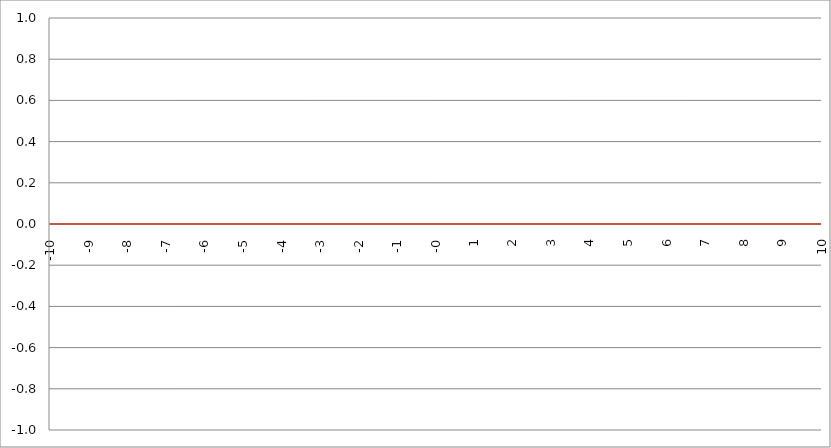
| Category | Series 1 |
|---|---|
| -10.0 | 0 |
| -9.99 | 0 |
| -9.98 | 0 |
| -9.97 | 0 |
| -9.96 | 0 |
| -9.95 | 0 |
| -9.940000000000001 | 0 |
| -9.930000000000001 | 0 |
| -9.920000000000002 | 0 |
| -9.91 | 0 |
| -9.900000000000002 | 0 |
| -9.890000000000002 | 0 |
| -9.880000000000003 | 0 |
| -9.870000000000003 | 0 |
| -9.860000000000001 | 0 |
| -9.850000000000003 | 0 |
| -9.840000000000003 | 0 |
| -9.830000000000004 | 0 |
| -9.820000000000004 | 0 |
| -9.810000000000004 | 0 |
| -9.800000000000004 | 0 |
| -9.790000000000004 | 0 |
| -9.780000000000005 | 0 |
| -9.770000000000005 | 0 |
| -9.760000000000005 | 0 |
| -9.750000000000005 | 0 |
| -9.740000000000006 | 0 |
| -9.730000000000006 | 0 |
| -9.720000000000006 | 0 |
| -9.710000000000006 | 0 |
| -9.700000000000006 | 0 |
| -9.690000000000007 | 0 |
| -9.680000000000007 | 0 |
| -9.670000000000007 | 0 |
| -9.660000000000007 | 0 |
| -9.650000000000007 | 0 |
| -9.640000000000008 | 0 |
| -9.630000000000008 | 0 |
| -9.620000000000008 | 0 |
| -9.610000000000008 | 0 |
| -9.600000000000009 | 0 |
| -9.590000000000009 | 0 |
| -9.580000000000007 | 0 |
| -9.57000000000001 | 0 |
| -9.56000000000001 | 0 |
| -9.55000000000001 | 0 |
| -9.54000000000001 | 0 |
| -9.53000000000001 | 0 |
| -9.52000000000001 | 0 |
| -9.51000000000001 | 0 |
| -9.50000000000001 | 0 |
| -9.49000000000001 | 0 |
| -9.48000000000001 | 0 |
| -9.47000000000001 | 0 |
| -9.46000000000001 | 0 |
| -9.45000000000001 | 0 |
| -9.44000000000001 | 0 |
| -9.430000000000012 | 0 |
| -9.420000000000012 | 0 |
| -9.410000000000013 | 0 |
| -9.400000000000013 | 0 |
| -9.390000000000011 | 0 |
| -9.380000000000013 | 0 |
| -9.370000000000013 | 0 |
| -9.360000000000014 | 0 |
| -9.350000000000014 | 0 |
| -9.340000000000014 | 0 |
| -9.330000000000014 | 0 |
| -9.320000000000014 | 0 |
| -9.310000000000015 | 0 |
| -9.300000000000013 | 0 |
| -9.290000000000015 | 0 |
| -9.280000000000015 | 0 |
| -9.270000000000016 | 0 |
| -9.260000000000016 | 0 |
| -9.250000000000014 | 0 |
| -9.240000000000016 | 0 |
| -9.230000000000016 | 0 |
| -9.220000000000017 | 0 |
| -9.210000000000017 | 0 |
| -9.200000000000017 | 0 |
| -9.190000000000017 | 0 |
| -9.180000000000017 | 0 |
| -9.170000000000018 | 0 |
| -9.160000000000016 | 0 |
| -9.150000000000018 | 0 |
| -9.140000000000018 | 0 |
| -9.130000000000019 | 0 |
| -9.120000000000019 | 0 |
| -9.110000000000017 | 0 |
| -9.10000000000002 | 0 |
| -9.09000000000002 | 0 |
| -9.08000000000002 | 0 |
| -9.07000000000002 | 0 |
| -9.06000000000002 | 0 |
| -9.05000000000002 | 0 |
| -9.04000000000002 | 0 |
| -9.03000000000002 | 0 |
| -9.020000000000021 | 0 |
| -9.010000000000021 | 0 |
| -9.000000000000021 | 0 |
| -8.990000000000022 | 0 |
| -8.980000000000022 | 0 |
| -8.97000000000002 | 0 |
| -8.960000000000022 | 0 |
| -8.950000000000022 | 0 |
| -8.940000000000023 | 0 |
| -8.930000000000023 | 0 |
| -8.920000000000023 | 0 |
| -8.910000000000023 | 0 |
| -8.900000000000023 | 0 |
| -8.890000000000024 | 0 |
| -8.880000000000024 | 0 |
| -8.870000000000024 | 0 |
| -8.860000000000024 | 0 |
| -8.850000000000025 | 0 |
| -8.840000000000025 | 0 |
| -8.830000000000025 | 0 |
| -8.820000000000025 | 0 |
| -8.810000000000025 | 0 |
| -8.800000000000026 | 0 |
| -8.790000000000026 | 0 |
| -8.780000000000026 | 0 |
| -8.770000000000026 | 0 |
| -8.760000000000026 | 0 |
| -8.750000000000027 | 0 |
| -8.740000000000027 | 0 |
| -8.730000000000027 | 0 |
| -8.720000000000027 | 0 |
| -8.710000000000027 | 0 |
| -8.700000000000028 | 0 |
| -8.690000000000028 | 0 |
| -8.680000000000028 | 0 |
| -8.670000000000028 | 0 |
| -8.660000000000029 | 0 |
| -8.650000000000029 | 0 |
| -8.640000000000029 | 0 |
| -8.63000000000003 | 0 |
| -8.62000000000003 | 0 |
| -8.61000000000003 | 0 |
| -8.60000000000003 | 0 |
| -8.59000000000003 | 0 |
| -8.58000000000003 | 0 |
| -8.57000000000003 | 0 |
| -8.56000000000003 | 0 |
| -8.55000000000003 | 0 |
| -8.540000000000031 | 0 |
| -8.530000000000031 | 0 |
| -8.520000000000032 | 0 |
| -8.510000000000032 | 0 |
| -8.50000000000003 | 0 |
| -8.490000000000032 | 0 |
| -8.480000000000032 | 0 |
| -8.470000000000033 | 0 |
| -8.460000000000033 | 0 |
| -8.450000000000033 | 0 |
| -8.440000000000033 | 0 |
| -8.430000000000033 | 0 |
| -8.420000000000034 | 0 |
| -8.410000000000032 | 0 |
| -8.400000000000034 | 0 |
| -8.390000000000034 | 0 |
| -8.380000000000035 | 0 |
| -8.370000000000035 | 0 |
| -8.360000000000033 | 0 |
| -8.350000000000035 | 0 |
| -8.340000000000035 | 0 |
| -8.330000000000036 | 0 |
| -8.320000000000036 | 0 |
| -8.310000000000034 | 0 |
| -8.300000000000036 | 0 |
| -8.290000000000036 | 0 |
| -8.280000000000037 | 0 |
| -8.270000000000037 | 0 |
| -8.260000000000037 | 0 |
| -8.250000000000037 | 0 |
| -8.240000000000038 | 0 |
| -8.230000000000038 | 0 |
| -8.220000000000038 | 0 |
| -8.210000000000038 | 0 |
| -8.200000000000038 | 0 |
| -8.190000000000039 | 0 |
| -8.180000000000039 | 0 |
| -8.170000000000037 | 0 |
| -8.16000000000004 | 0 |
| -8.15000000000004 | 0 |
| -8.14000000000004 | 0 |
| -8.13000000000004 | 0 |
| -8.12000000000004 | 0 |
| -8.11000000000004 | 0 |
| -8.10000000000004 | 0 |
| -8.09000000000004 | 0 |
| -8.08000000000004 | 0 |
| -8.07000000000004 | 0 |
| -8.06000000000004 | 0 |
| -8.05000000000004 | 0 |
| -8.040000000000042 | 0 |
| -8.03000000000004 | 0 |
| -8.020000000000042 | 0 |
| -8.010000000000042 | 0 |
| -8.000000000000043 | 0 |
| -7.990000000000043 | 0 |
| -7.980000000000043 | 0 |
| -7.970000000000043 | 0 |
| -7.960000000000043 | 0 |
| -7.950000000000044 | 0 |
| -7.940000000000044 | 0 |
| -7.930000000000044 | 0 |
| -7.920000000000044 | 0 |
| -7.910000000000044 | 0 |
| -7.900000000000044 | 0 |
| -7.890000000000045 | 0 |
| -7.880000000000045 | 0 |
| -7.870000000000045 | 0 |
| -7.860000000000046 | 0 |
| -7.850000000000046 | 0 |
| -7.840000000000046 | 0 |
| -7.830000000000046 | 0 |
| -7.820000000000046 | 0 |
| -7.810000000000047 | 0 |
| -7.800000000000047 | 0 |
| -7.790000000000047 | 0 |
| -7.780000000000047 | 0 |
| -7.770000000000047 | 0 |
| -7.760000000000048 | 0 |
| -7.750000000000048 | 0 |
| -7.740000000000048 | 0 |
| -7.730000000000048 | 0 |
| -7.720000000000049 | 0 |
| -7.710000000000049 | 0 |
| -7.700000000000049 | 0 |
| -7.690000000000049 | 0 |
| -7.680000000000049 | 0 |
| -7.67000000000005 | 0 |
| -7.66000000000005 | 0 |
| -7.65000000000005 | 0 |
| -7.64000000000005 | 0 |
| -7.63000000000005 | 0 |
| -7.620000000000051 | 0 |
| -7.610000000000051 | 0 |
| -7.600000000000051 | 0 |
| -7.590000000000051 | 0 |
| -7.580000000000052 | 0 |
| -7.570000000000052 | 0 |
| -7.560000000000052 | 0 |
| -7.550000000000052 | 0 |
| -7.540000000000052 | 0 |
| -7.530000000000053 | 0 |
| -7.520000000000053 | 0 |
| -7.510000000000053 | 0 |
| -7.500000000000053 | 0 |
| -7.490000000000053 | 0 |
| -7.480000000000054 | 0 |
| -7.470000000000054 | 0 |
| -7.460000000000054 | 0 |
| -7.450000000000054 | 0 |
| -7.440000000000054 | 0 |
| -7.430000000000054 | 0 |
| -7.420000000000055 | 0 |
| -7.410000000000055 | 0 |
| -7.400000000000055 | 0 |
| -7.390000000000056 | 0 |
| -7.380000000000056 | 0 |
| -7.370000000000056 | 0 |
| -7.360000000000056 | 0 |
| -7.350000000000056 | 0 |
| -7.340000000000057 | 0 |
| -7.330000000000057 | 0 |
| -7.320000000000057 | 0 |
| -7.310000000000057 | 0 |
| -7.300000000000058 | 0 |
| -7.290000000000058 | 0 |
| -7.280000000000058 | 0 |
| -7.270000000000058 | 0 |
| -7.260000000000058 | 0 |
| -7.250000000000059 | 0 |
| -7.240000000000059 | 0 |
| -7.23000000000006 | 0 |
| -7.220000000000059 | 0 |
| -7.210000000000059 | 0 |
| -7.20000000000006 | 0 |
| -7.19000000000006 | 0 |
| -7.18000000000006 | 0 |
| -7.17000000000006 | 0 |
| -7.160000000000061 | 0 |
| -7.150000000000061 | 0 |
| -7.140000000000061 | 0 |
| -7.130000000000061 | 0 |
| -7.120000000000061 | 0 |
| -7.110000000000062 | 0 |
| -7.100000000000062 | 0 |
| -7.090000000000062 | 0 |
| -7.080000000000062 | 0 |
| -7.070000000000062 | 0 |
| -7.060000000000063 | 0 |
| -7.050000000000063 | 0 |
| -7.040000000000063 | 0 |
| -7.030000000000063 | 0 |
| -7.020000000000064 | 0 |
| -7.010000000000064 | 0 |
| -7.000000000000064 | 0 |
| -6.990000000000064 | 0 |
| -6.980000000000064 | 0 |
| -6.970000000000064 | 0 |
| -6.960000000000064 | 0 |
| -6.950000000000064 | 0 |
| -6.940000000000065 | 0 |
| -6.930000000000065 | 0 |
| -6.920000000000065 | 0 |
| -6.910000000000065 | 0 |
| -6.900000000000066 | 0 |
| -6.890000000000066 | 0 |
| -6.880000000000066 | 0 |
| -6.870000000000066 | 0 |
| -6.860000000000067 | 0 |
| -6.850000000000067 | 0 |
| -6.840000000000067 | 0 |
| -6.830000000000067 | 0 |
| -6.820000000000068 | 0 |
| -6.810000000000068 | 0 |
| -6.800000000000068 | 0 |
| -6.790000000000068 | 0 |
| -6.780000000000068 | 0 |
| -6.770000000000068 | 0 |
| -6.760000000000069 | 0 |
| -6.75000000000007 | 0 |
| -6.74000000000007 | 0 |
| -6.73000000000007 | 0 |
| -6.72000000000007 | 0 |
| -6.71000000000007 | 0 |
| -6.70000000000007 | 0 |
| -6.69000000000007 | 0 |
| -6.680000000000071 | 0 |
| -6.670000000000071 | 0 |
| -6.660000000000071 | 0 |
| -6.650000000000071 | 0 |
| -6.640000000000072 | 0 |
| -6.630000000000072 | 0 |
| -6.620000000000072 | 0 |
| -6.610000000000072 | 0 |
| -6.600000000000072 | 0 |
| -6.590000000000073 | 0 |
| -6.580000000000073 | 0 |
| -6.570000000000073 | 0 |
| -6.560000000000073 | 0 |
| -6.550000000000074 | 0 |
| -6.540000000000074 | 0 |
| -6.530000000000074 | 0 |
| -6.520000000000074 | 0 |
| -6.510000000000074 | 0 |
| -6.500000000000074 | 0 |
| -6.490000000000074 | 0 |
| -6.480000000000074 | 0 |
| -6.470000000000075 | 0 |
| -6.460000000000075 | 0 |
| -6.450000000000075 | 0 |
| -6.440000000000075 | 0 |
| -6.430000000000076 | 0 |
| -6.420000000000076 | 0 |
| -6.410000000000076 | 0 |
| -6.400000000000076 | 0 |
| -6.390000000000077 | 0 |
| -6.380000000000077 | 0 |
| -6.370000000000077 | 0 |
| -6.360000000000078 | 0 |
| -6.350000000000078 | 0 |
| -6.340000000000078 | 0 |
| -6.330000000000078 | 0 |
| -6.320000000000078 | 0 |
| -6.310000000000079 | 0 |
| -6.300000000000079 | 0 |
| -6.29000000000008 | 0 |
| -6.28000000000008 | 0 |
| -6.27000000000008 | 0 |
| -6.26000000000008 | 0 |
| -6.25000000000008 | 0 |
| -6.24000000000008 | 0 |
| -6.23000000000008 | 0 |
| -6.220000000000081 | 0 |
| -6.210000000000081 | 0 |
| -6.200000000000081 | 0 |
| -6.190000000000081 | 0 |
| -6.180000000000081 | 0 |
| -6.170000000000082 | 0 |
| -6.160000000000082 | 0 |
| -6.150000000000082 | 0 |
| -6.140000000000082 | 0 |
| -6.130000000000082 | 0 |
| -6.120000000000083 | 0 |
| -6.110000000000083 | 0 |
| -6.100000000000083 | 0 |
| -6.090000000000083 | 0 |
| -6.080000000000084 | 0 |
| -6.070000000000084 | 0 |
| -6.060000000000084 | 0 |
| -6.050000000000084 | 0 |
| -6.040000000000084 | 0 |
| -6.030000000000084 | 0 |
| -6.020000000000085 | 0 |
| -6.010000000000085 | 0 |
| -6.000000000000085 | 0 |
| -5.990000000000085 | 0 |
| -5.980000000000085 | 0 |
| -5.970000000000085 | 0 |
| -5.960000000000086 | 0 |
| -5.950000000000086 | 0 |
| -5.940000000000086 | 0 |
| -5.930000000000086 | 0 |
| -5.920000000000087 | 0 |
| -5.910000000000087 | 0 |
| -5.900000000000087 | 0 |
| -5.890000000000088 | 0 |
| -5.880000000000088 | 0 |
| -5.870000000000088 | 0 |
| -5.860000000000088 | 0 |
| -5.850000000000088 | 0 |
| -5.840000000000089 | 0 |
| -5.830000000000089 | 0 |
| -5.820000000000089 | 0 |
| -5.810000000000089 | 0 |
| -5.800000000000089 | 0 |
| -5.79000000000009 | 0 |
| -5.78000000000009 | 0 |
| -5.77000000000009 | 0 |
| -5.76000000000009 | 0 |
| -5.750000000000091 | 0 |
| -5.740000000000091 | 0 |
| -5.730000000000091 | 0 |
| -5.720000000000091 | 0 |
| -5.710000000000091 | 0 |
| -5.700000000000092 | 0 |
| -5.690000000000092 | 0 |
| -5.680000000000092 | 0 |
| -5.670000000000092 | 0 |
| -5.660000000000092 | 0 |
| -5.650000000000093 | 0 |
| -5.640000000000093 | 0 |
| -5.630000000000093 | 0 |
| -5.620000000000093 | 0 |
| -5.610000000000093 | 0 |
| -5.600000000000094 | 0 |
| -5.590000000000094 | 0 |
| -5.580000000000094 | 0 |
| -5.570000000000094 | 0 |
| -5.560000000000095 | 0 |
| -5.550000000000095 | 0 |
| -5.540000000000095 | 0 |
| -5.530000000000095 | 0 |
| -5.520000000000095 | 0 |
| -5.510000000000096 | 0 |
| -5.500000000000096 | 0 |
| -5.490000000000096 | 0 |
| -5.480000000000096 | 0 |
| -5.470000000000096 | 0 |
| -5.460000000000097 | 0 |
| -5.450000000000097 | 0 |
| -5.440000000000097 | 0 |
| -5.430000000000097 | 0 |
| -5.420000000000098 | 0 |
| -5.410000000000098 | 0 |
| -5.400000000000098 | 0 |
| -5.390000000000098 | 0 |
| -5.380000000000098 | 0 |
| -5.370000000000099 | 0 |
| -5.360000000000099 | 0 |
| -5.350000000000099 | 0 |
| -5.340000000000099 | 0 |
| -5.330000000000099 | 0 |
| -5.3200000000001 | 0 |
| -5.3100000000001 | 0 |
| -5.3000000000001 | 0 |
| -5.2900000000001 | 0 |
| -5.2800000000001 | 0 |
| -5.2700000000001 | 0 |
| -5.260000000000101 | 0 |
| -5.250000000000101 | 0 |
| -5.240000000000101 | 0 |
| -5.230000000000101 | 0 |
| -5.220000000000102 | 0 |
| -5.210000000000102 | 0 |
| -5.200000000000102 | 0 |
| -5.190000000000103 | 0 |
| -5.180000000000103 | 0 |
| -5.170000000000103 | 0 |
| -5.160000000000103 | 0 |
| -5.150000000000103 | 0 |
| -5.140000000000104 | 0 |
| -5.130000000000104 | 0 |
| -5.120000000000104 | 0 |
| -5.110000000000104 | 0 |
| -5.100000000000104 | 0 |
| -5.090000000000104 | 0 |
| -5.080000000000104 | 0 |
| -5.070000000000105 | 0 |
| -5.060000000000105 | 0 |
| -5.050000000000105 | 0 |
| -5.040000000000105 | 0 |
| -5.030000000000105 | 0 |
| -5.020000000000106 | 0 |
| -5.010000000000106 | 0 |
| -5.000000000000106 | 0 |
| -4.990000000000106 | 0 |
| -4.980000000000106 | 0 |
| -4.970000000000107 | 0 |
| -4.960000000000107 | 0 |
| -4.950000000000107 | 0 |
| -4.940000000000107 | 0 |
| -4.930000000000108 | 0 |
| -4.920000000000108 | 0 |
| -4.910000000000108 | 0 |
| -4.900000000000108 | 0 |
| -4.890000000000109 | 0 |
| -4.88000000000011 | 0 |
| -4.87000000000011 | 0 |
| -4.86000000000011 | 0 |
| -4.85000000000011 | 0 |
| -4.84000000000011 | 0 |
| -4.83000000000011 | 0 |
| -4.82000000000011 | 0 |
| -4.810000000000111 | 0 |
| -4.800000000000111 | 0 |
| -4.790000000000111 | 0 |
| -4.780000000000111 | 0 |
| -4.770000000000111 | 0 |
| -4.760000000000112 | 0 |
| -4.750000000000112 | 0 |
| -4.740000000000112 | 0 |
| -4.730000000000112 | 0 |
| -4.720000000000112 | 0 |
| -4.710000000000113 | 0 |
| -4.700000000000113 | 0 |
| -4.690000000000113 | 0 |
| -4.680000000000113 | 0 |
| -4.670000000000114 | 0 |
| -4.660000000000114 | 0 |
| -4.650000000000114 | 0 |
| -4.640000000000114 | 0 |
| -4.630000000000114 | 0 |
| -4.620000000000115 | 0 |
| -4.610000000000115 | 0 |
| -4.600000000000115 | 0 |
| -4.590000000000115 | 0 |
| -4.580000000000115 | 0 |
| -4.570000000000115 | 0 |
| -4.560000000000116 | 0 |
| -4.550000000000116 | 0 |
| -4.540000000000116 | 0 |
| -4.530000000000116 | 0 |
| -4.520000000000117 | 0 |
| -4.510000000000117 | 0 |
| -4.500000000000117 | 0 |
| -4.490000000000117 | 0 |
| -4.480000000000117 | 0 |
| -4.470000000000117 | 0 |
| -4.460000000000118 | 0 |
| -4.450000000000118 | 0 |
| -4.440000000000118 | 0 |
| -4.430000000000118 | 0 |
| -4.420000000000119 | 0 |
| -4.41000000000012 | 0 |
| -4.40000000000012 | 0 |
| -4.39000000000012 | 0 |
| -4.38000000000012 | 0 |
| -4.37000000000012 | 0 |
| -4.36000000000012 | 0 |
| -4.35000000000012 | 0 |
| -4.34000000000012 | 0 |
| -4.33000000000012 | 0 |
| -4.320000000000121 | 0 |
| -4.310000000000121 | 0 |
| -4.300000000000121 | 0 |
| -4.290000000000121 | 0 |
| -4.280000000000121 | 0 |
| -4.270000000000122 | 0 |
| -4.260000000000122 | 0 |
| -4.250000000000122 | 0 |
| -4.240000000000122 | 0 |
| -4.230000000000122 | 0 |
| -4.220000000000123 | 0 |
| -4.210000000000123 | 0 |
| -4.200000000000123 | 0 |
| -4.190000000000124 | 0 |
| -4.180000000000124 | 0 |
| -4.170000000000124 | 0 |
| -4.160000000000124 | 0 |
| -4.150000000000124 | 0 |
| -4.140000000000124 | 0 |
| -4.130000000000125 | 0 |
| -4.120000000000125 | 0 |
| -4.110000000000125 | 0 |
| -4.100000000000125 | 0 |
| -4.090000000000125 | 0 |
| -4.080000000000126 | 0 |
| -4.070000000000126 | 0 |
| -4.060000000000126 | 0 |
| -4.050000000000126 | 0 |
| -4.040000000000127 | 0 |
| -4.030000000000127 | 0 |
| -4.020000000000127 | 0 |
| -4.010000000000127 | 0 |
| -4.000000000000127 | 0 |
| -3.990000000000128 | 0 |
| -3.980000000000128 | 0 |
| -3.970000000000129 | 0 |
| -3.960000000000129 | 0 |
| -3.950000000000129 | 0 |
| -3.940000000000129 | 0 |
| -3.930000000000129 | 0 |
| -3.92000000000013 | 0 |
| -3.91000000000013 | 0 |
| -3.90000000000013 | 0 |
| -3.89000000000013 | 0 |
| -3.88000000000013 | 0 |
| -3.870000000000131 | 0 |
| -3.860000000000131 | 0 |
| -3.850000000000131 | 0 |
| -3.840000000000131 | 0 |
| -3.830000000000131 | 0 |
| -3.820000000000132 | 0 |
| -3.810000000000132 | 0 |
| -3.800000000000132 | 0 |
| -3.790000000000132 | 0 |
| -3.780000000000132 | 0 |
| -3.770000000000133 | 0 |
| -3.760000000000133 | 0 |
| -3.750000000000133 | 0 |
| -3.740000000000133 | 0 |
| -3.730000000000134 | 0 |
| -3.720000000000134 | 0 |
| -3.710000000000134 | 0 |
| -3.700000000000134 | 0 |
| -3.690000000000134 | 0 |
| -3.680000000000135 | 0 |
| -3.670000000000135 | 0 |
| -3.660000000000135 | 0 |
| -3.650000000000135 | 0 |
| -3.640000000000135 | 0 |
| -3.630000000000136 | 0 |
| -3.620000000000136 | 0 |
| -3.610000000000136 | 0 |
| -3.600000000000136 | 0 |
| -3.590000000000137 | 0 |
| -3.580000000000137 | 0 |
| -3.570000000000137 | 0 |
| -3.560000000000137 | 0 |
| -3.550000000000137 | 0 |
| -3.540000000000138 | 0 |
| -3.530000000000138 | 0 |
| -3.520000000000138 | 0 |
| -3.510000000000138 | 0 |
| -3.500000000000139 | 0 |
| -3.490000000000139 | 0 |
| -3.480000000000139 | 0 |
| -3.470000000000139 | 0 |
| -3.460000000000139 | 0 |
| -3.45000000000014 | 0 |
| -3.44000000000014 | 0 |
| -3.43000000000014 | 0 |
| -3.42000000000014 | 0 |
| -3.41000000000014 | 0 |
| -3.400000000000141 | 0 |
| -3.390000000000141 | 0 |
| -3.380000000000141 | 0 |
| -3.370000000000141 | 0 |
| -3.360000000000141 | 0 |
| -3.350000000000142 | 0 |
| -3.340000000000142 | 0 |
| -3.330000000000142 | 0 |
| -3.320000000000142 | 0 |
| -3.310000000000143 | 0 |
| -3.300000000000143 | 0 |
| -3.290000000000143 | 0 |
| -3.280000000000143 | 0 |
| -3.270000000000143 | 0 |
| -3.260000000000144 | 0 |
| -3.250000000000144 | 0 |
| -3.240000000000144 | 0 |
| -3.230000000000144 | 0 |
| -3.220000000000145 | 0 |
| -3.210000000000145 | 0 |
| -3.200000000000145 | 0 |
| -3.190000000000145 | 0 |
| -3.180000000000145 | 0 |
| -3.170000000000146 | 0 |
| -3.160000000000146 | 0 |
| -3.150000000000146 | 0 |
| -3.140000000000146 | 0 |
| -3.130000000000146 | 0 |
| -3.120000000000147 | 0 |
| -3.110000000000147 | 0 |
| -3.100000000000147 | 0 |
| -3.090000000000147 | 0 |
| -3.080000000000147 | 0 |
| -3.070000000000148 | 0 |
| -3.060000000000148 | 0 |
| -3.050000000000148 | 0 |
| -3.040000000000148 | 0 |
| -3.030000000000149 | 0 |
| -3.020000000000149 | 0 |
| -3.010000000000149 | 0 |
| -3.000000000000149 | 0 |
| -2.990000000000149 | 0 |
| -2.98000000000015 | 0 |
| -2.97000000000015 | 0 |
| -2.96000000000015 | 0 |
| -2.95000000000015 | 0 |
| -2.94000000000015 | 0 |
| -2.930000000000151 | 0 |
| -2.920000000000151 | 0 |
| -2.910000000000151 | 0 |
| -2.900000000000151 | 0 |
| -2.890000000000151 | 0 |
| -2.880000000000152 | 0 |
| -2.870000000000152 | 0 |
| -2.860000000000152 | 0 |
| -2.850000000000152 | 0 |
| -2.840000000000153 | 0 |
| -2.830000000000153 | 0 |
| -2.820000000000153 | 0 |
| -2.810000000000153 | 0 |
| -2.800000000000153 | 0 |
| -2.790000000000154 | 0 |
| -2.780000000000154 | 0 |
| -2.770000000000154 | 0 |
| -2.760000000000154 | 0 |
| -2.750000000000154 | 0 |
| -2.740000000000155 | 0 |
| -2.730000000000155 | 0 |
| -2.720000000000155 | 0 |
| -2.710000000000155 | 0 |
| -2.700000000000156 | 0 |
| -2.690000000000156 | 0 |
| -2.680000000000156 | 0 |
| -2.670000000000156 | 0 |
| -2.660000000000156 | 0 |
| -2.650000000000157 | 0 |
| -2.640000000000157 | 0 |
| -2.630000000000157 | 0 |
| -2.620000000000157 | 0 |
| -2.610000000000157 | 0 |
| -2.600000000000158 | 0 |
| -2.590000000000158 | 0 |
| -2.580000000000158 | 0 |
| -2.570000000000158 | 0 |
| -2.560000000000159 | 0 |
| -2.550000000000159 | 0 |
| -2.54000000000016 | 0 |
| -2.530000000000159 | 0 |
| -2.520000000000159 | 0 |
| -2.51000000000016 | 0 |
| -2.50000000000016 | 0 |
| -2.49000000000016 | 0 |
| -2.48000000000016 | 0 |
| -2.47000000000016 | 0 |
| -2.460000000000161 | 0 |
| -2.450000000000161 | 0 |
| -2.440000000000161 | 0 |
| -2.430000000000161 | 0 |
| -2.420000000000162 | 0 |
| -2.410000000000162 | 0 |
| -2.400000000000162 | 0 |
| -2.390000000000162 | 0 |
| -2.380000000000162 | 0 |
| -2.370000000000163 | 0 |
| -2.360000000000163 | 0 |
| -2.350000000000163 | 0 |
| -2.340000000000163 | 0 |
| -2.330000000000163 | 0 |
| -2.320000000000164 | 0 |
| -2.310000000000164 | 0 |
| -2.300000000000164 | 0 |
| -2.290000000000164 | 0 |
| -2.280000000000165 | 0 |
| -2.270000000000165 | 0 |
| -2.260000000000165 | 0 |
| -2.250000000000165 | 0 |
| -2.240000000000165 | 0 |
| -2.230000000000166 | 0 |
| -2.220000000000166 | 0 |
| -2.210000000000166 | 0 |
| -2.200000000000166 | 0 |
| -2.190000000000166 | 0 |
| -2.180000000000167 | 0 |
| -2.170000000000167 | 0 |
| -2.160000000000167 | 0 |
| -2.150000000000167 | 0 |
| -2.140000000000168 | 0 |
| -2.130000000000168 | 0 |
| -2.120000000000168 | 0 |
| -2.110000000000168 | 0 |
| -2.100000000000168 | 0 |
| -2.090000000000169 | 0 |
| -2.080000000000169 | 0 |
| -2.070000000000169 | 0 |
| -2.060000000000169 | 0 |
| -2.050000000000169 | 0 |
| -2.04000000000017 | 0 |
| -2.03000000000017 | 0 |
| -2.02000000000017 | 0 |
| -2.01000000000017 | 0 |
| -2.000000000000171 | 0 |
| -1.99000000000017 | 0 |
| -1.98000000000017 | 0 |
| -1.97000000000017 | 0 |
| -1.96000000000017 | 0 |
| -1.95000000000017 | 0 |
| -1.94000000000017 | 0 |
| -1.93000000000017 | 0 |
| -1.92000000000017 | 0 |
| -1.91000000000017 | 0 |
| -1.90000000000017 | 0 |
| -1.89000000000017 | 0 |
| -1.88000000000017 | 0 |
| -1.87000000000017 | 0 |
| -1.86000000000017 | 0 |
| -1.85000000000017 | 0 |
| -1.84000000000017 | 0 |
| -1.83000000000017 | 0 |
| -1.82000000000017 | 0 |
| -1.81000000000017 | 0 |
| -1.80000000000017 | 0 |
| -1.79000000000017 | 0 |
| -1.78000000000017 | 0 |
| -1.77000000000017 | 0 |
| -1.76000000000017 | 0 |
| -1.75000000000017 | 0 |
| -1.74000000000017 | 0 |
| -1.73000000000017 | 0 |
| -1.72000000000017 | 0 |
| -1.71000000000017 | 0 |
| -1.70000000000017 | 0 |
| -1.69000000000017 | 0 |
| -1.68000000000017 | 0 |
| -1.67000000000017 | 0 |
| -1.66000000000017 | 0 |
| -1.65000000000017 | 0 |
| -1.64000000000017 | 0 |
| -1.63000000000017 | 0 |
| -1.62000000000017 | 0 |
| -1.61000000000017 | 0 |
| -1.60000000000017 | 0 |
| -1.59000000000017 | 0 |
| -1.58000000000017 | 0 |
| -1.57000000000017 | 0 |
| -1.56000000000017 | 0 |
| -1.55000000000017 | 0 |
| -1.54000000000017 | 0 |
| -1.53000000000017 | 0 |
| -1.52000000000017 | 0 |
| -1.51000000000017 | 0 |
| -1.50000000000017 | 0 |
| -1.49000000000017 | 0 |
| -1.48000000000017 | 0 |
| -1.47000000000017 | 0 |
| -1.46000000000017 | 0 |
| -1.45000000000017 | 0 |
| -1.44000000000017 | 0 |
| -1.43000000000017 | 0 |
| -1.42000000000017 | 0 |
| -1.41000000000017 | 0 |
| -1.40000000000017 | 0 |
| -1.39000000000017 | 0 |
| -1.38000000000017 | 0 |
| -1.37000000000017 | 0 |
| -1.36000000000017 | 0 |
| -1.35000000000017 | 0 |
| -1.34000000000017 | 0 |
| -1.33000000000017 | 0 |
| -1.32000000000017 | 0 |
| -1.31000000000017 | 0 |
| -1.30000000000017 | 0 |
| -1.29000000000017 | 0 |
| -1.28000000000017 | 0 |
| -1.27000000000017 | 0 |
| -1.26000000000017 | 0 |
| -1.25000000000017 | 0 |
| -1.24000000000017 | 0 |
| -1.23000000000017 | 0 |
| -1.22000000000017 | 0 |
| -1.21000000000017 | 0 |
| -1.20000000000017 | 0 |
| -1.19000000000017 | 0 |
| -1.18000000000017 | 0 |
| -1.17000000000017 | 0 |
| -1.16000000000017 | 0 |
| -1.15000000000017 | 0 |
| -1.14000000000017 | 0 |
| -1.13000000000017 | 0 |
| -1.12000000000017 | 0 |
| -1.11000000000017 | 0 |
| -1.10000000000017 | 0 |
| -1.09000000000017 | 0 |
| -1.08000000000017 | 0 |
| -1.07000000000017 | 0 |
| -1.06000000000017 | 0 |
| -1.05000000000017 | 0 |
| -1.04000000000017 | 0 |
| -1.03000000000017 | 0 |
| -1.02000000000017 | 0 |
| -1.01000000000017 | 0 |
| -1.00000000000017 | 0 |
| -0.99000000000017 | 0 |
| -0.98000000000017 | 0 |
| -0.97000000000017 | 0 |
| -0.96000000000017 | 0 |
| -0.95000000000017 | 0 |
| -0.94000000000017 | 0 |
| -0.93000000000017 | 0 |
| -0.92000000000017 | 0 |
| -0.91000000000017 | 0 |
| -0.90000000000017 | 0 |
| -0.890000000000169 | 0 |
| -0.880000000000169 | 0 |
| -0.870000000000169 | 0 |
| -0.860000000000169 | 0 |
| -0.850000000000169 | 0 |
| -0.840000000000169 | 0 |
| -0.830000000000169 | 0 |
| -0.820000000000169 | 0 |
| -0.810000000000169 | 0 |
| -0.800000000000169 | 0 |
| -0.790000000000169 | 0 |
| -0.780000000000169 | 0 |
| -0.770000000000169 | 0 |
| -0.760000000000169 | 0 |
| -0.750000000000169 | 0 |
| -0.740000000000169 | 0 |
| -0.730000000000169 | 0 |
| -0.720000000000169 | 0 |
| -0.710000000000169 | 0 |
| -0.700000000000169 | 0 |
| -0.690000000000169 | 0 |
| -0.680000000000169 | 0 |
| -0.670000000000169 | 0 |
| -0.660000000000169 | 0 |
| -0.650000000000169 | 0 |
| -0.640000000000169 | 0 |
| -0.630000000000169 | 0 |
| -0.620000000000169 | 0 |
| -0.610000000000169 | 0 |
| -0.600000000000169 | 0 |
| -0.590000000000169 | 0 |
| -0.580000000000169 | 0 |
| -0.570000000000169 | 0 |
| -0.560000000000169 | 0 |
| -0.550000000000169 | 0 |
| -0.540000000000169 | 0 |
| -0.530000000000169 | 0 |
| -0.520000000000169 | 0 |
| -0.510000000000169 | 0 |
| -0.500000000000169 | 0 |
| -0.490000000000169 | 0 |
| -0.480000000000169 | 0 |
| -0.470000000000169 | 0 |
| -0.460000000000169 | 0 |
| -0.450000000000169 | 0 |
| -0.440000000000169 | 0 |
| -0.430000000000169 | 0 |
| -0.420000000000169 | 0 |
| -0.410000000000169 | 0 |
| -0.400000000000169 | 0 |
| -0.390000000000169 | 0 |
| -0.380000000000169 | 0 |
| -0.370000000000169 | 0 |
| -0.360000000000169 | 0 |
| -0.350000000000169 | 0 |
| -0.340000000000169 | 0 |
| -0.330000000000169 | 0 |
| -0.320000000000169 | 0 |
| -0.310000000000169 | 0 |
| -0.300000000000169 | 0 |
| -0.290000000000169 | 0 |
| -0.280000000000169 | 0 |
| -0.270000000000169 | 0 |
| -0.260000000000169 | 0 |
| -0.250000000000169 | 0 |
| -0.240000000000169 | 0 |
| -0.230000000000169 | 0 |
| -0.220000000000169 | 0 |
| -0.210000000000169 | 0 |
| -0.200000000000169 | 0 |
| -0.190000000000169 | 0 |
| -0.180000000000169 | 0 |
| -0.170000000000169 | 0 |
| -0.160000000000169 | 0 |
| -0.150000000000169 | 0 |
| -0.140000000000169 | 0 |
| -0.130000000000169 | 0 |
| -0.120000000000169 | 0 |
| -0.110000000000169 | 0 |
| -0.100000000000169 | 0 |
| -0.0900000000001689 | 0 |
| -0.0800000000001689 | 0 |
| -0.0700000000001689 | 0 |
| -0.0600000000001689 | 0 |
| -0.0500000000001689 | 0 |
| -0.0400000000001689 | 0 |
| -0.0300000000001689 | 0 |
| -0.0200000000001689 | 0 |
| -0.0100000000001689 | 0 |
| -1.6888920817415e-13 | 0 |
| 0.00999999999983111 | 0 |
| 0.0199999999998311 | 0 |
| 0.0299999999998311 | 0 |
| 0.0399999999998311 | 0 |
| 0.0499999999998311 | 0 |
| 0.0599999999998311 | 0 |
| 0.0699999999998311 | 0 |
| 0.0799999999998311 | 0 |
| 0.0899999999998311 | 0 |
| 0.0999999999998311 | 0 |
| 0.109999999999831 | 0 |
| 0.119999999999831 | 0 |
| 0.129999999999831 | 0 |
| 0.139999999999831 | 0 |
| 0.149999999999831 | 0 |
| 0.159999999999831 | 0 |
| 0.169999999999831 | 0 |
| 0.179999999999831 | 0 |
| 0.189999999999831 | 0 |
| 0.199999999999831 | 0 |
| 0.209999999999831 | 0 |
| 0.219999999999831 | 0 |
| 0.229999999999831 | 0 |
| 0.239999999999831 | 0 |
| 0.249999999999831 | 0 |
| 0.259999999999831 | 0 |
| 0.269999999999831 | 0 |
| 0.279999999999831 | 0 |
| 0.289999999999831 | 0 |
| 0.299999999999831 | 0 |
| 0.309999999999831 | 0 |
| 0.319999999999831 | 0 |
| 0.329999999999831 | 0 |
| 0.339999999999831 | 0 |
| 0.349999999999831 | 0 |
| 0.359999999999831 | 0 |
| 0.369999999999831 | 0 |
| 0.379999999999831 | 0 |
| 0.389999999999831 | 0 |
| 0.399999999999831 | 0 |
| 0.409999999999831 | 0 |
| 0.419999999999831 | 0 |
| 0.429999999999831 | 0 |
| 0.439999999999831 | 0 |
| 0.449999999999831 | 0 |
| 0.459999999999831 | 0 |
| 0.469999999999831 | 0 |
| 0.479999999999831 | 0 |
| 0.489999999999831 | 0 |
| 0.499999999999831 | 0 |
| 0.509999999999831 | 0 |
| 0.519999999999831 | 0 |
| 0.529999999999831 | 0 |
| 0.539999999999831 | 0 |
| 0.549999999999831 | 0 |
| 0.559999999999831 | 0 |
| 0.569999999999831 | 0 |
| 0.579999999999831 | 0 |
| 0.589999999999831 | 0 |
| 0.599999999999831 | 0 |
| 0.609999999999831 | 0 |
| 0.619999999999831 | 0 |
| 0.629999999999831 | 0 |
| 0.639999999999831 | 0 |
| 0.649999999999831 | 0 |
| 0.659999999999831 | 0 |
| 0.669999999999831 | 0 |
| 0.679999999999831 | 0 |
| 0.689999999999831 | 0 |
| 0.699999999999831 | 0 |
| 0.709999999999831 | 0 |
| 0.719999999999831 | 0 |
| 0.729999999999831 | 0 |
| 0.739999999999831 | 0 |
| 0.749999999999832 | 0 |
| 0.759999999999832 | 0 |
| 0.769999999999832 | 0 |
| 0.779999999999832 | 0 |
| 0.789999999999832 | 0 |
| 0.799999999999832 | 0 |
| 0.809999999999832 | 0 |
| 0.819999999999832 | 0 |
| 0.829999999999832 | 0 |
| 0.839999999999832 | 0 |
| 0.849999999999832 | 0 |
| 0.859999999999832 | 0 |
| 0.869999999999832 | 0 |
| 0.879999999999832 | 0 |
| 0.889999999999832 | 0 |
| 0.899999999999832 | 0 |
| 0.909999999999832 | 0 |
| 0.919999999999832 | 0 |
| 0.929999999999832 | 0 |
| 0.939999999999832 | 0 |
| 0.949999999999832 | 0 |
| 0.959999999999832 | 0 |
| 0.969999999999832 | 0 |
| 0.979999999999832 | 0 |
| 0.989999999999832 | 0 |
| 0.999999999999832 | 0 |
| 1.009999999999832 | 0 |
| 1.019999999999832 | 0 |
| 1.029999999999832 | 0 |
| 1.039999999999832 | 0 |
| 1.049999999999832 | 0 |
| 1.059999999999832 | 0 |
| 1.069999999999832 | 0 |
| 1.079999999999832 | 0 |
| 1.089999999999832 | 0 |
| 1.099999999999832 | 0 |
| 1.109999999999832 | 0 |
| 1.119999999999832 | 0 |
| 1.129999999999832 | 0 |
| 1.139999999999832 | 0 |
| 1.149999999999832 | 0 |
| 1.159999999999832 | 0 |
| 1.169999999999832 | 0 |
| 1.179999999999832 | 0 |
| 1.189999999999832 | 0 |
| 1.199999999999832 | 0 |
| 1.209999999999832 | 0 |
| 1.219999999999832 | 0 |
| 1.229999999999832 | 0 |
| 1.239999999999832 | 0 |
| 1.249999999999832 | 0 |
| 1.259999999999832 | 0 |
| 1.269999999999832 | 0 |
| 1.279999999999832 | 0 |
| 1.289999999999832 | 0 |
| 1.299999999999832 | 0 |
| 1.309999999999832 | 0 |
| 1.319999999999832 | 0 |
| 1.329999999999832 | 0 |
| 1.339999999999832 | 0 |
| 1.349999999999832 | 0 |
| 1.359999999999832 | 0 |
| 1.369999999999832 | 0 |
| 1.379999999999832 | 0 |
| 1.389999999999832 | 0 |
| 1.399999999999832 | 0 |
| 1.409999999999832 | 0 |
| 1.419999999999832 | 0 |
| 1.429999999999832 | 0 |
| 1.439999999999832 | 0 |
| 1.449999999999832 | 0 |
| 1.459999999999832 | 0 |
| 1.469999999999832 | 0 |
| 1.479999999999832 | 0 |
| 1.489999999999832 | 0 |
| 1.499999999999832 | 0 |
| 1.509999999999832 | 0 |
| 1.519999999999832 | 0 |
| 1.529999999999832 | 0 |
| 1.539999999999832 | 0 |
| 1.549999999999832 | 0 |
| 1.559999999999832 | 0 |
| 1.569999999999832 | 0 |
| 1.579999999999832 | 0 |
| 1.589999999999832 | 0 |
| 1.599999999999832 | 0 |
| 1.609999999999832 | 0 |
| 1.619999999999832 | 0 |
| 1.629999999999832 | 0 |
| 1.639999999999832 | 0 |
| 1.649999999999832 | 0 |
| 1.659999999999832 | 0 |
| 1.669999999999832 | 0 |
| 1.679999999999832 | 0 |
| 1.689999999999832 | 0 |
| 1.699999999999832 | 0 |
| 1.709999999999832 | 0 |
| 1.719999999999832 | 0 |
| 1.729999999999832 | 0 |
| 1.739999999999832 | 0 |
| 1.749999999999832 | 0 |
| 1.759999999999832 | 0 |
| 1.769999999999832 | 0 |
| 1.779999999999832 | 0 |
| 1.789999999999832 | 0 |
| 1.799999999999832 | 0 |
| 1.809999999999832 | 0 |
| 1.819999999999832 | 0 |
| 1.829999999999832 | 0 |
| 1.839999999999832 | 0 |
| 1.849999999999832 | 0 |
| 1.859999999999832 | 0 |
| 1.869999999999832 | 0 |
| 1.879999999999832 | 0 |
| 1.889999999999832 | 0 |
| 1.899999999999832 | 0 |
| 1.909999999999832 | 0 |
| 1.919999999999832 | 0 |
| 1.929999999999832 | 0 |
| 1.939999999999832 | 0 |
| 1.949999999999833 | 0 |
| 1.959999999999833 | 0 |
| 1.969999999999833 | 0 |
| 1.979999999999833 | 0 |
| 1.989999999999833 | 0 |
| 1.999999999999833 | 0 |
| 2.009999999999832 | 0 |
| 2.019999999999832 | 0 |
| 2.029999999999832 | 0 |
| 2.039999999999832 | 0 |
| 2.049999999999832 | 0 |
| 2.059999999999831 | 0 |
| 2.069999999999831 | 0 |
| 2.079999999999831 | 0 |
| 2.089999999999831 | 0 |
| 2.09999999999983 | 0 |
| 2.10999999999983 | 0 |
| 2.11999999999983 | 0 |
| 2.12999999999983 | 0 |
| 2.13999999999983 | 0 |
| 2.149999999999829 | 0 |
| 2.159999999999829 | 0 |
| 2.169999999999829 | 0 |
| 2.179999999999829 | 0 |
| 2.189999999999829 | 0 |
| 2.199999999999828 | 0 |
| 2.209999999999828 | 0 |
| 2.219999999999828 | 0 |
| 2.229999999999828 | 0 |
| 2.239999999999827 | 0 |
| 2.249999999999827 | 0 |
| 2.259999999999827 | 0 |
| 2.269999999999827 | 0 |
| 2.279999999999827 | 0 |
| 2.289999999999826 | 0 |
| 2.299999999999826 | 0 |
| 2.309999999999826 | 0 |
| 2.319999999999826 | 0 |
| 2.329999999999825 | 0 |
| 2.339999999999825 | 0 |
| 2.349999999999825 | 0 |
| 2.359999999999825 | 0 |
| 2.369999999999825 | 0 |
| 2.379999999999824 | 0 |
| 2.389999999999824 | 0 |
| 2.399999999999824 | 0 |
| 2.409999999999824 | 0 |
| 2.419999999999824 | 0 |
| 2.429999999999823 | 0 |
| 2.439999999999823 | 0 |
| 2.449999999999823 | 0 |
| 2.459999999999823 | 0 |
| 2.469999999999823 | 0 |
| 2.479999999999822 | 0 |
| 2.489999999999822 | 0 |
| 2.499999999999822 | 0 |
| 2.509999999999822 | 0 |
| 2.519999999999821 | 0 |
| 2.529999999999821 | 0 |
| 2.539999999999821 | 0 |
| 2.549999999999821 | 0 |
| 2.559999999999821 | 0 |
| 2.56999999999982 | 0 |
| 2.57999999999982 | 0 |
| 2.58999999999982 | 0 |
| 2.59999999999982 | 0 |
| 2.609999999999819 | 0 |
| 2.619999999999819 | 0 |
| 2.629999999999819 | 0 |
| 2.639999999999819 | 0 |
| 2.649999999999819 | 0 |
| 2.659999999999818 | 0 |
| 2.669999999999818 | 0 |
| 2.679999999999818 | 0 |
| 2.689999999999818 | 0 |
| 2.699999999999818 | 0 |
| 2.709999999999817 | 0 |
| 2.719999999999817 | 0 |
| 2.729999999999817 | 0 |
| 2.739999999999817 | 0 |
| 2.749999999999817 | 0 |
| 2.759999999999816 | 0 |
| 2.769999999999816 | 0 |
| 2.779999999999816 | 0 |
| 2.789999999999816 | 0 |
| 2.799999999999815 | 0 |
| 2.809999999999815 | 0 |
| 2.819999999999815 | 0 |
| 2.829999999999815 | 0 |
| 2.839999999999815 | 0 |
| 2.849999999999814 | 0 |
| 2.859999999999814 | 0 |
| 2.869999999999814 | 0 |
| 2.879999999999814 | 0 |
| 2.889999999999814 | 0 |
| 2.899999999999813 | 0 |
| 2.909999999999813 | 0 |
| 2.919999999999813 | 0 |
| 2.929999999999813 | 0 |
| 2.939999999999813 | 0 |
| 2.949999999999812 | 0 |
| 2.959999999999812 | 0 |
| 2.969999999999812 | 0 |
| 2.979999999999812 | 0 |
| 2.989999999999811 | 0 |
| 2.999999999999811 | 0 |
| 3.009999999999811 | 0 |
| 3.019999999999811 | 0 |
| 3.029999999999811 | 0 |
| 3.03999999999981 | 0 |
| 3.04999999999981 | 0 |
| 3.05999999999981 | 0 |
| 3.06999999999981 | 0 |
| 3.07999999999981 | 0 |
| 3.089999999999809 | 0 |
| 3.099999999999809 | 0 |
| 3.109999999999809 | 0 |
| 3.119999999999809 | 0 |
| 3.129999999999808 | 0 |
| 3.139999999999808 | 0 |
| 3.149999999999808 | 0 |
| 3.159999999999808 | 0 |
| 3.169999999999808 | 0 |
| 3.179999999999807 | 0 |
| 3.189999999999807 | 0 |
| 3.199999999999807 | 0 |
| 3.209999999999807 | 0 |
| 3.219999999999807 | 0 |
| 3.229999999999806 | 0 |
| 3.239999999999806 | 0 |
| 3.249999999999806 | 0 |
| 3.259999999999806 | 0 |
| 3.269999999999805 | 0 |
| 3.279999999999805 | 0 |
| 3.289999999999805 | 0 |
| 3.299999999999805 | 0 |
| 3.309999999999805 | 0 |
| 3.319999999999804 | 0 |
| 3.329999999999804 | 0 |
| 3.339999999999804 | 0 |
| 3.349999999999804 | 0 |
| 3.359999999999804 | 0 |
| 3.369999999999803 | 0 |
| 3.379999999999803 | 0 |
| 3.389999999999803 | 0 |
| 3.399999999999803 | 0 |
| 3.409999999999802 | 0 |
| 3.419999999999802 | 0 |
| 3.429999999999802 | 0 |
| 3.439999999999802 | 0 |
| 3.449999999999802 | 0 |
| 3.459999999999801 | 0 |
| 3.469999999999801 | 0 |
| 3.479999999999801 | 0 |
| 3.489999999999801 | 0 |
| 3.499999999999801 | 0 |
| 3.5099999999998 | 0 |
| 3.5199999999998 | 0 |
| 3.5299999999998 | 0 |
| 3.5399999999998 | 0 |
| 3.5499999999998 | 0 |
| 3.559999999999799 | 0 |
| 3.569999999999799 | 0 |
| 3.579999999999799 | 0 |
| 3.589999999999799 | 0 |
| 3.599999999999798 | 0 |
| 3.609999999999798 | 0 |
| 3.619999999999798 | 0 |
| 3.629999999999798 | 0 |
| 3.639999999999798 | 0 |
| 3.649999999999797 | 0 |
| 3.659999999999797 | 0 |
| 3.669999999999797 | 0 |
| 3.679999999999797 | 0 |
| 3.689999999999796 | 0 |
| 3.699999999999796 | 0 |
| 3.709999999999796 | 0 |
| 3.719999999999796 | 0 |
| 3.729999999999796 | 0 |
| 3.739999999999795 | 0 |
| 3.749999999999795 | 0 |
| 3.759999999999795 | 0 |
| 3.769999999999795 | 0 |
| 3.779999999999795 | 0 |
| 3.789999999999794 | 0 |
| 3.799999999999794 | 0 |
| 3.809999999999794 | 0 |
| 3.819999999999794 | 0 |
| 3.829999999999794 | 0 |
| 3.839999999999793 | 0 |
| 3.849999999999793 | 0 |
| 3.859999999999793 | 0 |
| 3.869999999999793 | 0 |
| 3.879999999999792 | 0 |
| 3.889999999999792 | 0 |
| 3.899999999999792 | 0 |
| 3.909999999999792 | 0 |
| 3.919999999999792 | 0 |
| 3.929999999999791 | 0 |
| 3.939999999999791 | 0 |
| 3.949999999999791 | 0 |
| 3.959999999999791 | 0 |
| 3.969999999999791 | 0 |
| 3.97999999999979 | 0 |
| 3.98999999999979 | 0 |
| 3.99999999999979 | 0 |
| 4.00999999999979 | 0 |
| 4.01999999999979 | 0 |
| 4.02999999999979 | 0 |
| 4.03999999999979 | 0 |
| 4.04999999999979 | 0 |
| 4.05999999999979 | 0 |
| 4.069999999999789 | 0 |
| 4.079999999999788 | 0 |
| 4.089999999999788 | 0 |
| 4.099999999999788 | 0 |
| 4.109999999999788 | 0 |
| 4.119999999999788 | 0 |
| 4.129999999999788 | 0 |
| 4.139999999999787 | 0 |
| 4.149999999999787 | 0 |
| 4.159999999999787 | 0 |
| 4.169999999999787 | 0 |
| 4.179999999999786 | 0 |
| 4.189999999999786 | 0 |
| 4.199999999999786 | 0 |
| 4.209999999999785 | 0 |
| 4.219999999999785 | 0 |
| 4.229999999999785 | 0 |
| 4.239999999999785 | 0 |
| 4.249999999999785 | 0 |
| 4.259999999999784 | 0 |
| 4.269999999999784 | 0 |
| 4.279999999999784 | 0 |
| 4.289999999999784 | 0 |
| 4.299999999999784 | 0 |
| 4.309999999999784 | 0 |
| 4.319999999999784 | 0 |
| 4.329999999999783 | 0 |
| 4.339999999999783 | 0 |
| 4.349999999999783 | 0 |
| 4.359999999999783 | 0 |
| 4.369999999999782 | 0 |
| 4.379999999999782 | 0 |
| 4.389999999999782 | 0 |
| 4.399999999999782 | 0 |
| 4.409999999999781 | 0 |
| 4.419999999999781 | 0 |
| 4.429999999999781 | 0 |
| 4.43999999999978 | 0 |
| 4.44999999999978 | 0 |
| 4.45999999999978 | 0 |
| 4.46999999999978 | 0 |
| 4.47999999999978 | 0 |
| 4.48999999999978 | 0 |
| 4.49999999999978 | 0 |
| 4.50999999999978 | 0 |
| 4.51999999999978 | 0 |
| 4.52999999999978 | 0 |
| 4.539999999999778 | 0 |
| 4.549999999999778 | 0 |
| 4.559999999999778 | 0 |
| 4.569999999999778 | 0 |
| 4.579999999999778 | 0 |
| 4.589999999999777 | 0 |
| 4.599999999999777 | 0 |
| 4.609999999999777 | 0 |
| 4.619999999999777 | 0 |
| 4.629999999999777 | 0 |
| 4.639999999999776 | 0 |
| 4.649999999999776 | 0 |
| 4.659999999999776 | 0 |
| 4.669999999999776 | 0 |
| 4.679999999999775 | 0 |
| 4.689999999999775 | 0 |
| 4.699999999999775 | 0 |
| 4.709999999999775 | 0 |
| 4.719999999999774 | 0 |
| 4.729999999999774 | 0 |
| 4.739999999999774 | 0 |
| 4.749999999999774 | 0 |
| 4.759999999999774 | 0 |
| 4.769999999999774 | 0 |
| 4.779999999999773 | 0 |
| 4.789999999999773 | 0 |
| 4.799999999999773 | 0 |
| 4.809999999999773 | 0 |
| 4.819999999999773 | 0 |
| 4.829999999999773 | 0 |
| 4.839999999999772 | 0 |
| 4.849999999999772 | 0 |
| 4.859999999999772 | 0 |
| 4.869999999999772 | 0 |
| 4.879999999999771 | 0 |
| 4.889999999999771 | 0 |
| 4.899999999999771 | 0 |
| 4.90999999999977 | 0 |
| 4.91999999999977 | 0 |
| 4.92999999999977 | 0 |
| 4.93999999999977 | 0 |
| 4.94999999999977 | 0 |
| 4.95999999999977 | 0 |
| 4.96999999999977 | 0 |
| 4.97999999999977 | 0 |
| 4.98999999999977 | 0 |
| 4.99999999999977 | 0 |
| 5.009999999999768 | 0 |
| 5.019999999999768 | 0 |
| 5.029999999999768 | 0 |
| 5.039999999999768 | 0 |
| 5.049999999999767 | 0 |
| 5.059999999999767 | 0 |
| 5.069999999999767 | 0 |
| 5.079999999999767 | 0 |
| 5.089999999999767 | 0 |
| 5.099999999999766 | 0 |
| 5.109999999999766 | 0 |
| 5.119999999999766 | 0 |
| 5.129999999999766 | 0 |
| 5.139999999999766 | 0 |
| 5.149999999999765 | 0 |
| 5.159999999999765 | 0 |
| 5.169999999999765 | 0 |
| 5.179999999999765 | 0 |
| 5.189999999999764 | 0 |
| 5.199999999999764 | 0 |
| 5.209999999999764 | 0 |
| 5.219999999999764 | 0 |
| 5.229999999999764 | 0 |
| 5.239999999999763 | 0 |
| 5.249999999999763 | 0 |
| 5.259999999999763 | 0 |
| 5.269999999999763 | 0 |
| 5.279999999999763 | 0 |
| 5.289999999999762 | 0 |
| 5.299999999999762 | 0 |
| 5.309999999999762 | 0 |
| 5.319999999999762 | 0 |
| 5.329999999999762 | 0 |
| 5.339999999999761 | 0 |
| 5.349999999999761 | 0 |
| 5.359999999999761 | 0 |
| 5.369999999999761 | 0 |
| 5.37999999999976 | 0 |
| 5.38999999999976 | 0 |
| 5.39999999999976 | 0 |
| 5.40999999999976 | 0 |
| 5.41999999999976 | 0 |
| 5.42999999999976 | 0 |
| 5.43999999999976 | 0 |
| 5.44999999999976 | 0 |
| 5.45999999999976 | 0 |
| 5.46999999999976 | 0 |
| 5.479999999999758 | 0 |
| 5.489999999999758 | 0 |
| 5.499999999999758 | 0 |
| 5.509999999999758 | 0 |
| 5.519999999999758 | 0 |
| 5.529999999999758 | 0 |
| 5.539999999999757 | 0 |
| 5.549999999999757 | 0 |
| 5.559999999999757 | 0 |
| 5.569999999999757 | 0 |
| 5.579999999999756 | 0 |
| 5.589999999999756 | 0 |
| 5.599999999999756 | 0 |
| 5.609999999999756 | 0 |
| 5.619999999999756 | 0 |
| 5.629999999999756 | 0 |
| 5.639999999999755 | 0 |
| 5.649999999999755 | 0 |
| 5.659999999999755 | 0 |
| 5.669999999999755 | 0 |
| 5.679999999999754 | 0 |
| 5.689999999999754 | 0 |
| 5.699999999999754 | 0 |
| 5.709999999999754 | 0 |
| 5.719999999999754 | 0 |
| 5.729999999999753 | 0 |
| 5.739999999999753 | 0 |
| 5.749999999999753 | 0 |
| 5.759999999999753 | 0 |
| 5.769999999999753 | 0 |
| 5.779999999999752 | 0 |
| 5.789999999999752 | 0 |
| 5.799999999999752 | 0 |
| 5.809999999999752 | 0 |
| 5.819999999999752 | 0 |
| 5.829999999999751 | 0 |
| 5.839999999999751 | 0 |
| 5.849999999999751 | 0 |
| 5.859999999999751 | 0 |
| 5.86999999999975 | 0 |
| 5.87999999999975 | 0 |
| 5.88999999999975 | 0 |
| 5.89999999999975 | 0 |
| 5.90999999999975 | 0 |
| 5.91999999999975 | 0 |
| 5.92999999999975 | 0 |
| 5.93999999999975 | 0 |
| 5.949999999999748 | 0 |
| 5.959999999999748 | 0 |
| 5.969999999999748 | 0 |
| 5.979999999999748 | 0 |
| 5.989999999999747 | 0 |
| 5.999999999999747 | 0 |
| 6.009999999999747 | 0 |
| 6.019999999999747 | 0 |
| 6.029999999999747 | 0 |
| 6.039999999999746 | 0 |
| 6.049999999999746 | 0 |
| 6.059999999999746 | 0 |
| 6.069999999999746 | 0 |
| 6.079999999999746 | 0 |
| 6.089999999999745 | 0 |
| 6.099999999999745 | 0 |
| 6.109999999999745 | 0 |
| 6.119999999999745 | 0 |
| 6.129999999999745 | 0 |
| 6.139999999999744 | 0 |
| 6.149999999999744 | 0 |
| 6.159999999999744 | 0 |
| 6.169999999999744 | 0 |
| 6.179999999999744 | 0 |
| 6.189999999999744 | 0 |
| 6.199999999999743 | 0 |
| 6.209999999999743 | 0 |
| 6.219999999999743 | 0 |
| 6.229999999999743 | 0 |
| 6.239999999999742 | 0 |
| 6.249999999999742 | 0 |
| 6.259999999999742 | 0 |
| 6.269999999999742 | 0 |
| 6.279999999999741 | 0 |
| 6.289999999999741 | 0 |
| 6.299999999999741 | 0 |
| 6.309999999999741 | 0 |
| 6.319999999999741 | 0 |
| 6.329999999999741 | 0 |
| 6.33999999999974 | 0 |
| 6.34999999999974 | 0 |
| 6.35999999999974 | 0 |
| 6.36999999999974 | 0 |
| 6.37999999999974 | 0 |
| 6.38999999999974 | 0 |
| 6.39999999999974 | 0 |
| 6.409999999999738 | 0 |
| 6.419999999999738 | 0 |
| 6.429999999999738 | 0 |
| 6.439999999999738 | 0 |
| 6.449999999999738 | 0 |
| 6.459999999999737 | 0 |
| 6.469999999999737 | 0 |
| 6.479999999999737 | 0 |
| 6.489999999999737 | 0 |
| 6.499999999999737 | 0 |
| 6.509999999999736 | 0 |
| 6.519999999999736 | 0 |
| 6.529999999999736 | 0 |
| 6.539999999999736 | 0 |
| 6.549999999999736 | 0 |
| 6.559999999999735 | 0 |
| 6.569999999999735 | 0 |
| 6.579999999999735 | 0 |
| 6.589999999999735 | 0 |
| 6.599999999999734 | 0 |
| 6.609999999999734 | 0 |
| 6.619999999999734 | 0 |
| 6.629999999999734 | 0 |
| 6.639999999999734 | 0 |
| 6.649999999999734 | 0 |
| 6.659999999999734 | 0 |
| 6.669999999999733 | 0 |
| 6.679999999999733 | 0 |
| 6.689999999999733 | 0 |
| 6.699999999999733 | 0 |
| 6.709999999999732 | 0 |
| 6.719999999999732 | 0 |
| 6.729999999999732 | 0 |
| 6.739999999999731 | 0 |
| 6.749999999999731 | 0 |
| 6.759999999999731 | 0 |
| 6.769999999999731 | 0 |
| 6.77999999999973 | 0 |
| 6.78999999999973 | 0 |
| 6.79999999999973 | 0 |
| 6.80999999999973 | 0 |
| 6.81999999999973 | 0 |
| 6.82999999999973 | 0 |
| 6.83999999999973 | 0 |
| 6.84999999999973 | 0 |
| 6.85999999999973 | 0 |
| 6.86999999999973 | 0 |
| 6.879999999999728 | 0 |
| 6.889999999999728 | 0 |
| 6.899999999999728 | 0 |
| 6.909999999999728 | 0 |
| 6.919999999999728 | 0 |
| 6.929999999999727 | 0 |
| 6.939999999999727 | 0 |
| 6.949999999999727 | 0 |
| 6.959999999999727 | 0 |
| 6.969999999999727 | 0 |
| 6.979999999999726 | 0 |
| 6.989999999999726 | 0 |
| 6.999999999999726 | 0 |
| 7.009999999999726 | 0 |
| 7.019999999999726 | 0 |
| 7.029999999999725 | 0 |
| 7.039999999999725 | 0 |
| 7.049999999999725 | 0 |
| 7.059999999999725 | 0 |
| 7.069999999999724 | 0 |
| 7.079999999999724 | 0 |
| 7.089999999999724 | 0 |
| 7.099999999999724 | 0 |
| 7.109999999999724 | 0 |
| 7.119999999999724 | 0 |
| 7.129999999999724 | 0 |
| 7.139999999999723 | 0 |
| 7.149999999999723 | 0 |
| 7.159999999999723 | 0 |
| 7.169999999999723 | 0 |
| 7.179999999999722 | 0 |
| 7.189999999999722 | 0 |
| 7.199999999999722 | 0 |
| 7.209999999999721 | 0 |
| 7.219999999999721 | 0 |
| 7.229999999999721 | 0 |
| 7.23999999999972 | 0 |
| 7.24999999999972 | 0 |
| 7.25999999999972 | 0 |
| 7.26999999999972 | 0 |
| 7.27999999999972 | 0 |
| 7.28999999999972 | 0 |
| 7.29999999999972 | 0 |
| 7.30999999999972 | 0 |
| 7.31999999999972 | 0 |
| 7.329999999999719 | 0 |
| 7.33999999999972 | 0 |
| 7.349999999999719 | 0 |
| 7.359999999999719 | 0 |
| 7.369999999999718 | 0 |
| 7.379999999999718 | 0 |
| 7.389999999999718 | 0 |
| 7.399999999999718 | 0 |
| 7.409999999999717 | 0 |
| 7.419999999999717 | 0 |
| 7.429999999999717 | 0 |
| 7.439999999999717 | 0 |
| 7.449999999999716 | 0 |
| 7.459999999999716 | 0 |
| 7.469999999999716 | 0 |
| 7.479999999999716 | 0 |
| 7.489999999999715 | 0 |
| 7.499999999999715 | 0 |
| 7.509999999999715 | 0 |
| 7.519999999999715 | 0 |
| 7.529999999999715 | 0 |
| 7.539999999999714 | 0 |
| 7.549999999999714 | 0 |
| 7.559999999999714 | 0 |
| 7.569999999999714 | 0 |
| 7.579999999999714 | 0 |
| 7.589999999999714 | 0 |
| 7.599999999999714 | 0 |
| 7.609999999999713 | 0 |
| 7.619999999999713 | 0 |
| 7.629999999999713 | 0 |
| 7.639999999999713 | 0 |
| 7.649999999999712 | 0 |
| 7.659999999999712 | 0 |
| 7.669999999999712 | 0 |
| 7.679999999999712 | 0 |
| 7.689999999999712 | 0 |
| 7.699999999999711 | 0 |
| 7.709999999999711 | 0 |
| 7.719999999999711 | 0 |
| 7.729999999999711 | 0 |
| 7.73999999999971 | 0 |
| 7.74999999999971 | 0 |
| 7.75999999999971 | 0 |
| 7.76999999999971 | 0 |
| 7.77999999999971 | 0 |
| 7.78999999999971 | 0 |
| 7.79999999999971 | 0 |
| 7.80999999999971 | 0 |
| 7.819999999999709 | 0 |
| 7.829999999999709 | 0 |
| 7.839999999999708 | 0 |
| 7.849999999999708 | 0 |
| 7.859999999999708 | 0 |
| 7.869999999999708 | 0 |
| 7.879999999999707 | 0 |
| 7.889999999999707 | 0 |
| 7.899999999999707 | 0 |
| 7.909999999999707 | 0 |
| 7.919999999999706 | 0 |
| 7.929999999999706 | 0 |
| 7.939999999999706 | 0 |
| 7.949999999999706 | 0 |
| 7.959999999999705 | 0 |
| 7.969999999999705 | 0 |
| 7.979999999999705 | 0 |
| 7.989999999999705 | 0 |
| 7.999999999999705 | 0 |
| 8.009999999999703 | 0 |
| 8.019999999999705 | 0 |
| 8.029999999999704 | 0 |
| 8.039999999999704 | 0 |
| 8.049999999999704 | 0 |
| 8.059999999999704 | 0 |
| 8.069999999999704 | 0 |
| 8.079999999999703 | 0 |
| 8.089999999999703 | 0 |
| 8.099999999999701 | 0 |
| 8.109999999999703 | 0 |
| 8.119999999999703 | 0 |
| 8.129999999999702 | 0 |
| 8.139999999999702 | 0 |
| 8.1499999999997 | 0 |
| 8.1599999999997 | 0 |
| 8.1699999999997 | 0 |
| 8.1799999999997 | 0 |
| 8.1899999999997 | 0 |
| 8.1999999999997 | 0 |
| 8.2099999999997 | 0 |
| 8.2199999999997 | 0 |
| 8.2299999999997 | 0 |
| 8.2399999999997 | 0 |
| 8.2499999999997 | 0 |
| 8.2599999999997 | 0 |
| 8.2699999999997 | 0 |
| 8.2799999999997 | 0 |
| 8.289999999999697 | 0 |
| 8.299999999999699 | 0 |
| 8.309999999999699 | 0 |
| 8.319999999999698 | 0 |
| 8.329999999999698 | 0 |
| 8.339999999999698 | 0 |
| 8.349999999999698 | 0 |
| 8.359999999999697 | 0 |
| 8.369999999999697 | 0 |
| 8.379999999999695 | 0 |
| 8.389999999999697 | 0 |
| 8.399999999999697 | 0 |
| 8.409999999999696 | 0 |
| 8.419999999999696 | 0 |
| 8.429999999999694 | 0 |
| 8.439999999999696 | 0 |
| 8.449999999999696 | 0 |
| 8.459999999999695 | 0 |
| 8.469999999999695 | 0 |
| 8.479999999999693 | 0 |
| 8.489999999999695 | 0 |
| 8.499999999999694 | 0 |
| 8.509999999999694 | 0 |
| 8.519999999999694 | 0 |
| 8.529999999999694 | 0 |
| 8.539999999999694 | 0 |
| 8.549999999999693 | 0 |
| 8.55999999999969 | 0 |
| 8.56999999999969 | 0 |
| 8.57999999999969 | 0 |
| 8.58999999999969 | 0 |
| 8.59999999999969 | 0 |
| 8.60999999999969 | 0 |
| 8.61999999999969 | 0 |
| 8.62999999999969 | 0 |
| 8.63999999999969 | 0 |
| 8.64999999999969 | 0 |
| 8.65999999999969 | 0 |
| 8.66999999999969 | 0 |
| 8.67999999999969 | 0 |
| 8.68999999999969 | 0 |
| 8.69999999999969 | 0 |
| 8.70999999999969 | 0 |
| 8.71999999999969 | 0 |
| 8.72999999999969 | 0 |
| 8.73999999999969 | 0 |
| 8.74999999999969 | 0 |
| 8.759999999999687 | 0 |
| 8.769999999999689 | 0 |
| 8.779999999999688 | 0 |
| 8.789999999999688 | 0 |
| 8.799999999999686 | 0 |
| 8.809999999999688 | 0 |
| 8.819999999999688 | 0 |
| 8.829999999999687 | 0 |
| 8.839999999999687 | 0 |
| 8.849999999999685 | 0 |
| 8.859999999999687 | 0 |
| 8.869999999999687 | 0 |
| 8.879999999999686 | 0 |
| 8.889999999999686 | 0 |
| 8.899999999999684 | 0 |
| 8.909999999999686 | 0 |
| 8.919999999999686 | 0 |
| 8.929999999999685 | 0 |
| 8.939999999999685 | 0 |
| 8.949999999999685 | 0 |
| 8.959999999999685 | 0 |
| 8.969999999999684 | 0 |
| 8.979999999999684 | 0 |
| 8.989999999999682 | 0 |
| 8.999999999999684 | 0 |
| 9.009999999999684 | 0 |
| 9.019999999999683 | 0 |
| 9.029999999999683 | 0 |
| 9.039999999999681 | 0 |
| 9.049999999999683 | 0 |
| 9.05999999999968 | 0 |
| 9.06999999999968 | 0 |
| 9.07999999999968 | 0 |
| 9.08999999999968 | 0 |
| 9.09999999999968 | 0 |
| 9.10999999999968 | 0 |
| 9.11999999999968 | 0 |
| 9.12999999999968 | 0 |
| 9.13999999999968 | 0 |
| 9.14999999999968 | 0 |
| 9.15999999999968 | 0 |
| 9.16999999999968 | 0 |
| 9.17999999999968 | 0 |
| 9.18999999999968 | 0 |
| 9.19999999999968 | 0 |
| 9.20999999999968 | 0 |
| 9.21999999999968 | 0 |
| 9.229999999999677 | 0 |
| 9.239999999999679 | 0 |
| 9.249999999999678 | 0 |
| 9.259999999999678 | 0 |
| 9.269999999999678 | 0 |
| 9.279999999999678 | 0 |
| 9.289999999999678 | 0 |
| 9.299999999999677 | 0 |
| 9.309999999999677 | 0 |
| 9.319999999999675 | 0 |
| 9.329999999999677 | 0 |
| 9.339999999999677 | 0 |
| 9.349999999999676 | 0 |
| 9.359999999999676 | 0 |
| 9.369999999999674 | 0 |
| 9.379999999999676 | 0 |
| 9.389999999999675 | 0 |
| 9.399999999999675 | 0 |
| 9.409999999999675 | 0 |
| 9.419999999999675 | 0 |
| 9.429999999999675 | 0 |
| 9.439999999999674 | 0 |
| 9.449999999999674 | 0 |
| 9.459999999999672 | 0 |
| 9.469999999999674 | 0 |
| 9.479999999999674 | 0 |
| 9.489999999999673 | 0 |
| 9.499999999999673 | 0 |
| 9.509999999999671 | 0 |
| 9.519999999999673 | 0 |
| 9.529999999999673 | 0 |
| 9.539999999999672 | 0 |
| 9.549999999999672 | 0 |
| 9.55999999999967 | 0 |
| 9.56999999999967 | 0 |
| 9.57999999999967 | 0 |
| 9.58999999999967 | 0 |
| 9.59999999999967 | 0 |
| 9.60999999999967 | 0 |
| 9.61999999999967 | 0 |
| 9.62999999999967 | 0 |
| 9.63999999999967 | 0 |
| 9.64999999999967 | 0 |
| 9.65999999999967 | 0 |
| 9.66999999999967 | 0 |
| 9.67999999999967 | 0 |
| 9.689999999999667 | 0 |
| 9.699999999999669 | 0 |
| 9.709999999999669 | 0 |
| 9.719999999999668 | 0 |
| 9.729999999999668 | 0 |
| 9.739999999999666 | 0 |
| 9.749999999999668 | 0 |
| 9.759999999999668 | 0 |
| 9.769999999999667 | 0 |
| 9.779999999999667 | 0 |
| 9.789999999999665 | 0 |
| 9.799999999999667 | 0 |
| 9.809999999999667 | 0 |
| 9.819999999999666 | 0 |
| 9.829999999999666 | 0 |
| 9.839999999999664 | 0 |
| 9.849999999999666 | 0 |
| 9.859999999999665 | 0 |
| 9.869999999999665 | 0 |
| 9.879999999999663 | 0 |
| 9.889999999999665 | 0 |
| 9.899999999999665 | 0 |
| 9.909999999999664 | 0 |
| 9.919999999999664 | 0 |
| 9.929999999999662 | 0 |
| 9.939999999999664 | 0 |
| 9.949999999999664 | 0 |
| 9.95999999999966 | 0 |
| 9.96999999999966 | 0 |
| 9.97999999999966 | 0 |
| 9.98999999999966 | 0 |
| 9.99999999999966 | 0 |